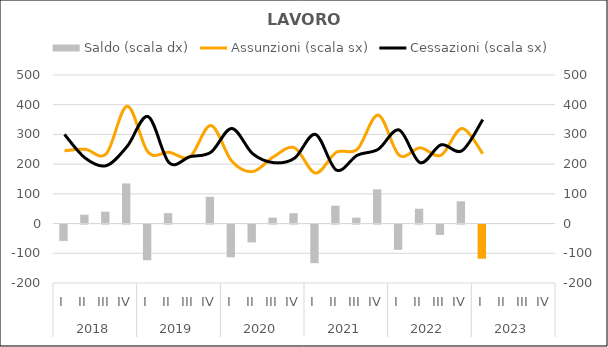
| Category | Saldo (scala dx) |
|---|---|
| 0 | -55 |
| 1 | 30 |
| 2 | 40 |
| 3 | 135 |
| 4 | -120 |
| 5 | 35 |
| 6 | 0 |
| 7 | 90 |
| 8 | -110 |
| 9 | -60 |
| 10 | 20 |
| 11 | 35 |
| 12 | -130 |
| 13 | 60 |
| 14 | 20 |
| 15 | 115 |
| 16 | -85 |
| 17 | 50 |
| 18 | -35 |
| 19 | 75 |
| 20 | -115 |
| 21 | 0 |
| 22 | 0 |
| 23 | 0 |